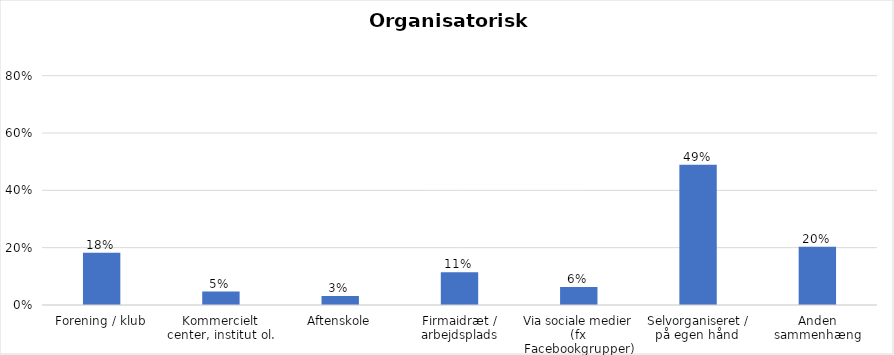
| Category | % |
|---|---|
| Forening / klub | 0.182 |
| Kommercielt center, institut ol. | 0.047 |
| Aftenskole | 0.031 |
| Firmaidræt / arbejdsplads | 0.115 |
| Via sociale medier (fx Facebookgrupper) | 0.062 |
| Selvorganiseret / på egen hånd  | 0.49 |
| Anden sammenhæng | 0.203 |